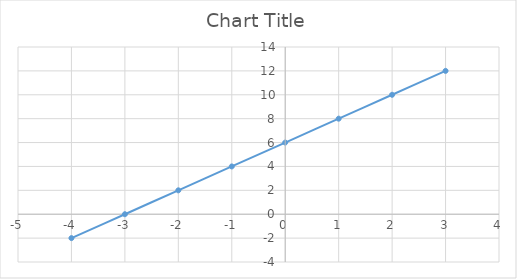
| Category | Series 0 |
|---|---|
| -4.0 | -2 |
| -3.0 | 0 |
| -2.0 | 2 |
| -1.0 | 4 |
| 0.0 | 6 |
| 1.0 | 8 |
| 2.0 | 10 |
| 3.0 | 12 |